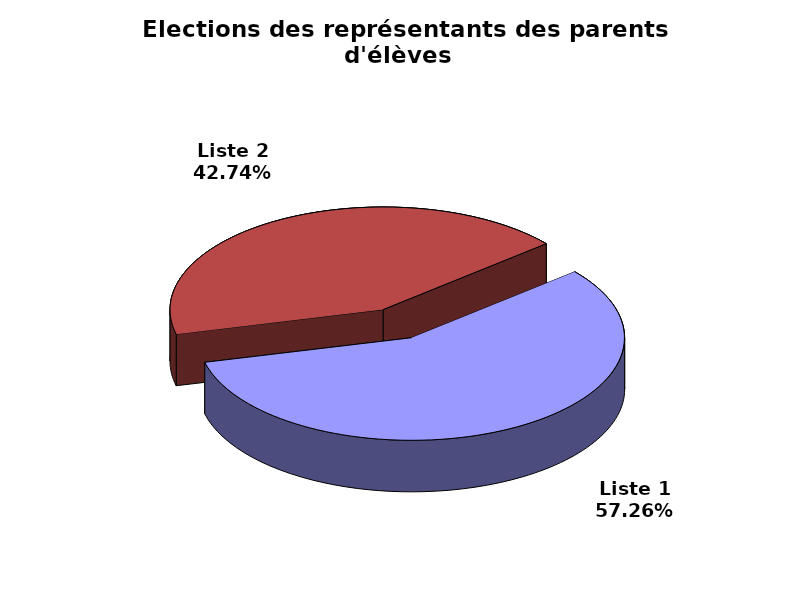
| Category | Series 0 |
|---|---|
| Liste 1 | 71 |
| Liste 2 | 53 |